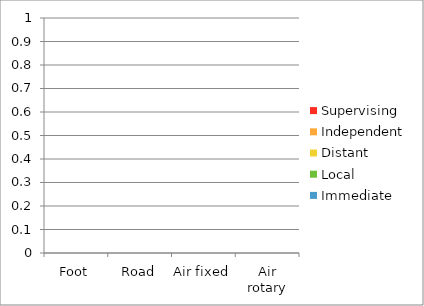
| Category | Immediate | Local | Distant | Independent | Supervising |
|---|---|---|---|---|---|
| Foot | 0 | 0 | 0 | 0 | 0 |
| Road | 0 | 0 | 0 | 0 | 0 |
| Air fixed | 0 | 0 | 0 | 0 | 0 |
| Air rotary | 0 | 0 | 0 | 0 | 0 |